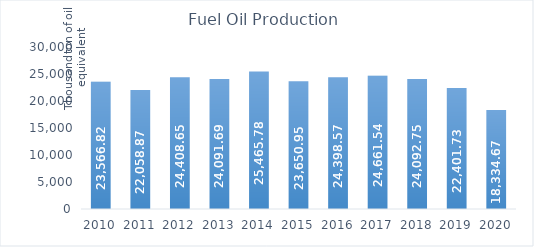
| Category | Fuel Oil Production* |
|---|---|
| 2010.0 | 23566.82 |
| 2011.0 | 22058.87 |
| 2012.0 | 24408.65 |
| 2013.0 | 24091.69 |
| 2014.0 | 25465.78 |
| 2015.0 | 23650.95 |
| 2016.0 | 24398.57 |
| 2017.0 | 24661.54 |
| 2018.0 | 24092.75 |
| 2019.0 | 22401.73 |
| 2020.0 | 18334.67 |